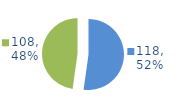
| Category | Series 0 |
|---|---|
| 0 | 118 |
| 1 | 108 |